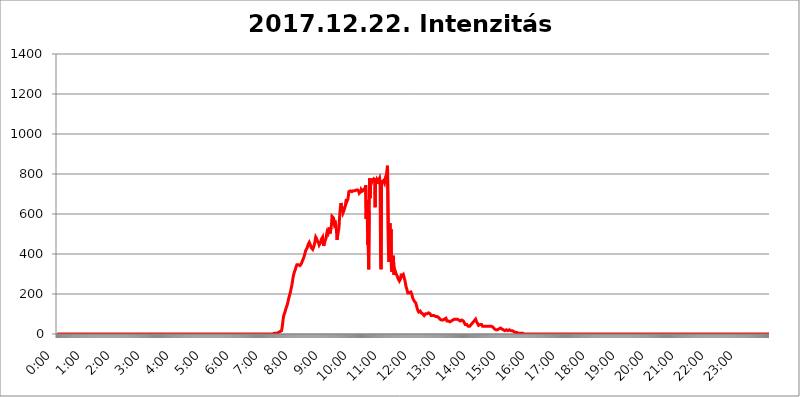
| Category | 2017.12.22. Intenzitás [W/m^2] |
|---|---|
| 0.0 | 0 |
| 0.0006944444444444445 | 0 |
| 0.001388888888888889 | 0 |
| 0.0020833333333333333 | 0 |
| 0.002777777777777778 | 0 |
| 0.003472222222222222 | 0 |
| 0.004166666666666667 | 0 |
| 0.004861111111111111 | 0 |
| 0.005555555555555556 | 0 |
| 0.0062499999999999995 | 0 |
| 0.006944444444444444 | 0 |
| 0.007638888888888889 | 0 |
| 0.008333333333333333 | 0 |
| 0.009027777777777779 | 0 |
| 0.009722222222222222 | 0 |
| 0.010416666666666666 | 0 |
| 0.011111111111111112 | 0 |
| 0.011805555555555555 | 0 |
| 0.012499999999999999 | 0 |
| 0.013194444444444444 | 0 |
| 0.013888888888888888 | 0 |
| 0.014583333333333332 | 0 |
| 0.015277777777777777 | 0 |
| 0.015972222222222224 | 0 |
| 0.016666666666666666 | 0 |
| 0.017361111111111112 | 0 |
| 0.018055555555555557 | 0 |
| 0.01875 | 0 |
| 0.019444444444444445 | 0 |
| 0.02013888888888889 | 0 |
| 0.020833333333333332 | 0 |
| 0.02152777777777778 | 0 |
| 0.022222222222222223 | 0 |
| 0.02291666666666667 | 0 |
| 0.02361111111111111 | 0 |
| 0.024305555555555556 | 0 |
| 0.024999999999999998 | 0 |
| 0.025694444444444447 | 0 |
| 0.02638888888888889 | 0 |
| 0.027083333333333334 | 0 |
| 0.027777777777777776 | 0 |
| 0.02847222222222222 | 0 |
| 0.029166666666666664 | 0 |
| 0.029861111111111113 | 0 |
| 0.030555555555555555 | 0 |
| 0.03125 | 0 |
| 0.03194444444444445 | 0 |
| 0.03263888888888889 | 0 |
| 0.03333333333333333 | 0 |
| 0.034027777777777775 | 0 |
| 0.034722222222222224 | 0 |
| 0.035416666666666666 | 0 |
| 0.036111111111111115 | 0 |
| 0.03680555555555556 | 0 |
| 0.0375 | 0 |
| 0.03819444444444444 | 0 |
| 0.03888888888888889 | 0 |
| 0.03958333333333333 | 0 |
| 0.04027777777777778 | 0 |
| 0.04097222222222222 | 0 |
| 0.041666666666666664 | 0 |
| 0.042361111111111106 | 0 |
| 0.04305555555555556 | 0 |
| 0.043750000000000004 | 0 |
| 0.044444444444444446 | 0 |
| 0.04513888888888889 | 0 |
| 0.04583333333333334 | 0 |
| 0.04652777777777778 | 0 |
| 0.04722222222222222 | 0 |
| 0.04791666666666666 | 0 |
| 0.04861111111111111 | 0 |
| 0.049305555555555554 | 0 |
| 0.049999999999999996 | 0 |
| 0.05069444444444445 | 0 |
| 0.051388888888888894 | 0 |
| 0.052083333333333336 | 0 |
| 0.05277777777777778 | 0 |
| 0.05347222222222222 | 0 |
| 0.05416666666666667 | 0 |
| 0.05486111111111111 | 0 |
| 0.05555555555555555 | 0 |
| 0.05625 | 0 |
| 0.05694444444444444 | 0 |
| 0.057638888888888885 | 0 |
| 0.05833333333333333 | 0 |
| 0.05902777777777778 | 0 |
| 0.059722222222222225 | 0 |
| 0.06041666666666667 | 0 |
| 0.061111111111111116 | 0 |
| 0.06180555555555556 | 0 |
| 0.0625 | 0 |
| 0.06319444444444444 | 0 |
| 0.06388888888888888 | 0 |
| 0.06458333333333334 | 0 |
| 0.06527777777777778 | 0 |
| 0.06597222222222222 | 0 |
| 0.06666666666666667 | 0 |
| 0.06736111111111111 | 0 |
| 0.06805555555555555 | 0 |
| 0.06874999999999999 | 0 |
| 0.06944444444444443 | 0 |
| 0.07013888888888889 | 0 |
| 0.07083333333333333 | 0 |
| 0.07152777777777779 | 0 |
| 0.07222222222222223 | 0 |
| 0.07291666666666667 | 0 |
| 0.07361111111111111 | 0 |
| 0.07430555555555556 | 0 |
| 0.075 | 0 |
| 0.07569444444444444 | 0 |
| 0.0763888888888889 | 0 |
| 0.07708333333333334 | 0 |
| 0.07777777777777778 | 0 |
| 0.07847222222222222 | 0 |
| 0.07916666666666666 | 0 |
| 0.0798611111111111 | 0 |
| 0.08055555555555556 | 0 |
| 0.08125 | 0 |
| 0.08194444444444444 | 0 |
| 0.08263888888888889 | 0 |
| 0.08333333333333333 | 0 |
| 0.08402777777777777 | 0 |
| 0.08472222222222221 | 0 |
| 0.08541666666666665 | 0 |
| 0.08611111111111112 | 0 |
| 0.08680555555555557 | 0 |
| 0.08750000000000001 | 0 |
| 0.08819444444444445 | 0 |
| 0.08888888888888889 | 0 |
| 0.08958333333333333 | 0 |
| 0.09027777777777778 | 0 |
| 0.09097222222222222 | 0 |
| 0.09166666666666667 | 0 |
| 0.09236111111111112 | 0 |
| 0.09305555555555556 | 0 |
| 0.09375 | 0 |
| 0.09444444444444444 | 0 |
| 0.09513888888888888 | 0 |
| 0.09583333333333333 | 0 |
| 0.09652777777777777 | 0 |
| 0.09722222222222222 | 0 |
| 0.09791666666666667 | 0 |
| 0.09861111111111111 | 0 |
| 0.09930555555555555 | 0 |
| 0.09999999999999999 | 0 |
| 0.10069444444444443 | 0 |
| 0.1013888888888889 | 0 |
| 0.10208333333333335 | 0 |
| 0.10277777777777779 | 0 |
| 0.10347222222222223 | 0 |
| 0.10416666666666667 | 0 |
| 0.10486111111111111 | 0 |
| 0.10555555555555556 | 0 |
| 0.10625 | 0 |
| 0.10694444444444444 | 0 |
| 0.1076388888888889 | 0 |
| 0.10833333333333334 | 0 |
| 0.10902777777777778 | 0 |
| 0.10972222222222222 | 0 |
| 0.1111111111111111 | 0 |
| 0.11180555555555556 | 0 |
| 0.11180555555555556 | 0 |
| 0.1125 | 0 |
| 0.11319444444444444 | 0 |
| 0.11388888888888889 | 0 |
| 0.11458333333333333 | 0 |
| 0.11527777777777777 | 0 |
| 0.11597222222222221 | 0 |
| 0.11666666666666665 | 0 |
| 0.1173611111111111 | 0 |
| 0.11805555555555557 | 0 |
| 0.11944444444444445 | 0 |
| 0.12013888888888889 | 0 |
| 0.12083333333333333 | 0 |
| 0.12152777777777778 | 0 |
| 0.12222222222222223 | 0 |
| 0.12291666666666667 | 0 |
| 0.12291666666666667 | 0 |
| 0.12361111111111112 | 0 |
| 0.12430555555555556 | 0 |
| 0.125 | 0 |
| 0.12569444444444444 | 0 |
| 0.12638888888888888 | 0 |
| 0.12708333333333333 | 0 |
| 0.16875 | 0 |
| 0.12847222222222224 | 0 |
| 0.12916666666666668 | 0 |
| 0.12986111111111112 | 0 |
| 0.13055555555555556 | 0 |
| 0.13125 | 0 |
| 0.13194444444444445 | 0 |
| 0.1326388888888889 | 0 |
| 0.13333333333333333 | 0 |
| 0.13402777777777777 | 0 |
| 0.13402777777777777 | 0 |
| 0.13472222222222222 | 0 |
| 0.13541666666666666 | 0 |
| 0.1361111111111111 | 0 |
| 0.13749999999999998 | 0 |
| 0.13819444444444443 | 0 |
| 0.1388888888888889 | 0 |
| 0.13958333333333334 | 0 |
| 0.14027777777777778 | 0 |
| 0.14097222222222222 | 0 |
| 0.14166666666666666 | 0 |
| 0.1423611111111111 | 0 |
| 0.14305555555555557 | 0 |
| 0.14375000000000002 | 0 |
| 0.14444444444444446 | 0 |
| 0.1451388888888889 | 0 |
| 0.1451388888888889 | 0 |
| 0.14652777777777778 | 0 |
| 0.14722222222222223 | 0 |
| 0.14791666666666667 | 0 |
| 0.1486111111111111 | 0 |
| 0.14930555555555555 | 0 |
| 0.15 | 0 |
| 0.15069444444444444 | 0 |
| 0.15138888888888888 | 0 |
| 0.15208333333333332 | 0 |
| 0.15277777777777776 | 0 |
| 0.15347222222222223 | 0 |
| 0.15416666666666667 | 0 |
| 0.15486111111111112 | 0 |
| 0.15555555555555556 | 0 |
| 0.15625 | 0 |
| 0.15694444444444444 | 0 |
| 0.15763888888888888 | 0 |
| 0.15833333333333333 | 0 |
| 0.15902777777777777 | 0 |
| 0.15972222222222224 | 0 |
| 0.16041666666666668 | 0 |
| 0.16111111111111112 | 0 |
| 0.16180555555555556 | 0 |
| 0.1625 | 0 |
| 0.16319444444444445 | 0 |
| 0.1638888888888889 | 0 |
| 0.16458333333333333 | 0 |
| 0.16527777777777777 | 0 |
| 0.16597222222222222 | 0 |
| 0.16666666666666666 | 0 |
| 0.1673611111111111 | 0 |
| 0.16805555555555554 | 0 |
| 0.16874999999999998 | 0 |
| 0.16944444444444443 | 0 |
| 0.17013888888888887 | 0 |
| 0.1708333333333333 | 0 |
| 0.17152777777777775 | 0 |
| 0.17222222222222225 | 0 |
| 0.1729166666666667 | 0 |
| 0.17361111111111113 | 0 |
| 0.17430555555555557 | 0 |
| 0.17500000000000002 | 0 |
| 0.17569444444444446 | 0 |
| 0.1763888888888889 | 0 |
| 0.17708333333333334 | 0 |
| 0.17777777777777778 | 0 |
| 0.17847222222222223 | 0 |
| 0.17916666666666667 | 0 |
| 0.1798611111111111 | 0 |
| 0.18055555555555555 | 0 |
| 0.18125 | 0 |
| 0.18194444444444444 | 0 |
| 0.1826388888888889 | 0 |
| 0.18333333333333335 | 0 |
| 0.1840277777777778 | 0 |
| 0.18472222222222223 | 0 |
| 0.18541666666666667 | 0 |
| 0.18611111111111112 | 0 |
| 0.18680555555555556 | 0 |
| 0.1875 | 0 |
| 0.18819444444444444 | 0 |
| 0.18888888888888888 | 0 |
| 0.18958333333333333 | 0 |
| 0.19027777777777777 | 0 |
| 0.1909722222222222 | 0 |
| 0.19166666666666665 | 0 |
| 0.19236111111111112 | 0 |
| 0.19305555555555554 | 0 |
| 0.19375 | 0 |
| 0.19444444444444445 | 0 |
| 0.1951388888888889 | 0 |
| 0.19583333333333333 | 0 |
| 0.19652777777777777 | 0 |
| 0.19722222222222222 | 0 |
| 0.19791666666666666 | 0 |
| 0.1986111111111111 | 0 |
| 0.19930555555555554 | 0 |
| 0.19999999999999998 | 0 |
| 0.20069444444444443 | 0 |
| 0.20138888888888887 | 0 |
| 0.2020833333333333 | 0 |
| 0.2027777777777778 | 0 |
| 0.2034722222222222 | 0 |
| 0.2041666666666667 | 0 |
| 0.20486111111111113 | 0 |
| 0.20555555555555557 | 0 |
| 0.20625000000000002 | 0 |
| 0.20694444444444446 | 0 |
| 0.2076388888888889 | 0 |
| 0.20833333333333334 | 0 |
| 0.20902777777777778 | 0 |
| 0.20972222222222223 | 0 |
| 0.21041666666666667 | 0 |
| 0.2111111111111111 | 0 |
| 0.21180555555555555 | 0 |
| 0.2125 | 0 |
| 0.21319444444444444 | 0 |
| 0.2138888888888889 | 0 |
| 0.21458333333333335 | 0 |
| 0.2152777777777778 | 0 |
| 0.21597222222222223 | 0 |
| 0.21666666666666667 | 0 |
| 0.21736111111111112 | 0 |
| 0.21805555555555556 | 0 |
| 0.21875 | 0 |
| 0.21944444444444444 | 0 |
| 0.22013888888888888 | 0 |
| 0.22083333333333333 | 0 |
| 0.22152777777777777 | 0 |
| 0.2222222222222222 | 0 |
| 0.22291666666666665 | 0 |
| 0.2236111111111111 | 0 |
| 0.22430555555555556 | 0 |
| 0.225 | 0 |
| 0.22569444444444445 | 0 |
| 0.2263888888888889 | 0 |
| 0.22708333333333333 | 0 |
| 0.22777777777777777 | 0 |
| 0.22847222222222222 | 0 |
| 0.22916666666666666 | 0 |
| 0.2298611111111111 | 0 |
| 0.23055555555555554 | 0 |
| 0.23124999999999998 | 0 |
| 0.23194444444444443 | 0 |
| 0.23263888888888887 | 0 |
| 0.2333333333333333 | 0 |
| 0.2340277777777778 | 0 |
| 0.2347222222222222 | 0 |
| 0.2354166666666667 | 0 |
| 0.23611111111111113 | 0 |
| 0.23680555555555557 | 0 |
| 0.23750000000000002 | 0 |
| 0.23819444444444446 | 0 |
| 0.2388888888888889 | 0 |
| 0.23958333333333334 | 0 |
| 0.24027777777777778 | 0 |
| 0.24097222222222223 | 0 |
| 0.24166666666666667 | 0 |
| 0.2423611111111111 | 0 |
| 0.24305555555555555 | 0 |
| 0.24375 | 0 |
| 0.24444444444444446 | 0 |
| 0.24513888888888888 | 0 |
| 0.24583333333333335 | 0 |
| 0.2465277777777778 | 0 |
| 0.24722222222222223 | 0 |
| 0.24791666666666667 | 0 |
| 0.24861111111111112 | 0 |
| 0.24930555555555556 | 0 |
| 0.25 | 0 |
| 0.25069444444444444 | 0 |
| 0.2513888888888889 | 0 |
| 0.2520833333333333 | 0 |
| 0.25277777777777777 | 0 |
| 0.2534722222222222 | 0 |
| 0.25416666666666665 | 0 |
| 0.2548611111111111 | 0 |
| 0.2555555555555556 | 0 |
| 0.25625000000000003 | 0 |
| 0.2569444444444445 | 0 |
| 0.2576388888888889 | 0 |
| 0.25833333333333336 | 0 |
| 0.2590277777777778 | 0 |
| 0.25972222222222224 | 0 |
| 0.2604166666666667 | 0 |
| 0.2611111111111111 | 0 |
| 0.26180555555555557 | 0 |
| 0.2625 | 0 |
| 0.26319444444444445 | 0 |
| 0.2638888888888889 | 0 |
| 0.26458333333333334 | 0 |
| 0.2652777777777778 | 0 |
| 0.2659722222222222 | 0 |
| 0.26666666666666666 | 0 |
| 0.2673611111111111 | 0 |
| 0.26805555555555555 | 0 |
| 0.26875 | 0 |
| 0.26944444444444443 | 0 |
| 0.2701388888888889 | 0 |
| 0.2708333333333333 | 0 |
| 0.27152777777777776 | 0 |
| 0.2722222222222222 | 0 |
| 0.27291666666666664 | 0 |
| 0.2736111111111111 | 0 |
| 0.2743055555555555 | 0 |
| 0.27499999999999997 | 0 |
| 0.27569444444444446 | 0 |
| 0.27638888888888885 | 0 |
| 0.27708333333333335 | 0 |
| 0.2777777777777778 | 0 |
| 0.27847222222222223 | 0 |
| 0.2791666666666667 | 0 |
| 0.2798611111111111 | 0 |
| 0.28055555555555556 | 0 |
| 0.28125 | 0 |
| 0.28194444444444444 | 0 |
| 0.2826388888888889 | 0 |
| 0.2833333333333333 | 0 |
| 0.28402777777777777 | 0 |
| 0.2847222222222222 | 0 |
| 0.28541666666666665 | 0 |
| 0.28611111111111115 | 0 |
| 0.28680555555555554 | 0 |
| 0.28750000000000003 | 0 |
| 0.2881944444444445 | 0 |
| 0.2888888888888889 | 0 |
| 0.28958333333333336 | 0 |
| 0.2902777777777778 | 0 |
| 0.29097222222222224 | 0 |
| 0.2916666666666667 | 0 |
| 0.2923611111111111 | 0 |
| 0.29305555555555557 | 0 |
| 0.29375 | 0 |
| 0.29444444444444445 | 0 |
| 0.2951388888888889 | 0 |
| 0.29583333333333334 | 0 |
| 0.2965277777777778 | 0 |
| 0.2972222222222222 | 0 |
| 0.29791666666666666 | 0 |
| 0.2986111111111111 | 0 |
| 0.29930555555555555 | 0 |
| 0.3 | 0 |
| 0.30069444444444443 | 0 |
| 0.3013888888888889 | 0 |
| 0.3020833333333333 | 0 |
| 0.30277777777777776 | 3.525 |
| 0.3034722222222222 | 3.525 |
| 0.30416666666666664 | 3.525 |
| 0.3048611111111111 | 3.525 |
| 0.3055555555555555 | 3.525 |
| 0.30624999999999997 | 3.525 |
| 0.3069444444444444 | 3.525 |
| 0.3076388888888889 | 3.525 |
| 0.30833333333333335 | 3.525 |
| 0.3090277777777778 | 3.525 |
| 0.30972222222222223 | 7.887 |
| 0.3104166666666667 | 7.887 |
| 0.3111111111111111 | 7.887 |
| 0.31180555555555556 | 7.887 |
| 0.3125 | 12.257 |
| 0.31319444444444444 | 12.257 |
| 0.3138888888888889 | 12.257 |
| 0.3145833333333333 | 16.636 |
| 0.31527777777777777 | 29.823 |
| 0.3159722222222222 | 47.511 |
| 0.31666666666666665 | 69.775 |
| 0.31736111111111115 | 87.692 |
| 0.31805555555555554 | 96.682 |
| 0.31875000000000003 | 101.184 |
| 0.3194444444444445 | 110.201 |
| 0.3201388888888889 | 119.235 |
| 0.32083333333333336 | 128.284 |
| 0.3215277777777778 | 132.814 |
| 0.32222222222222224 | 141.884 |
| 0.3229166666666667 | 150.964 |
| 0.3236111111111111 | 160.056 |
| 0.32430555555555557 | 173.709 |
| 0.325 | 182.82 |
| 0.32569444444444445 | 191.937 |
| 0.3263888888888889 | 201.058 |
| 0.32708333333333334 | 210.182 |
| 0.3277777777777778 | 223.873 |
| 0.3284722222222222 | 233 |
| 0.32916666666666666 | 246.689 |
| 0.3298611111111111 | 260.373 |
| 0.33055555555555555 | 278.603 |
| 0.33125 | 292.259 |
| 0.33194444444444443 | 301.354 |
| 0.3326388888888889 | 310.44 |
| 0.3333333333333333 | 314.98 |
| 0.3340277777777778 | 324.052 |
| 0.3347222222222222 | 333.113 |
| 0.3354166666666667 | 337.639 |
| 0.3361111111111111 | 346.682 |
| 0.3368055555555556 | 346.682 |
| 0.33749999999999997 | 346.682 |
| 0.33819444444444446 | 346.682 |
| 0.33888888888888885 | 346.682 |
| 0.33958333333333335 | 342.162 |
| 0.34027777777777773 | 342.162 |
| 0.34097222222222223 | 342.162 |
| 0.3416666666666666 | 346.682 |
| 0.3423611111111111 | 351.198 |
| 0.3430555555555555 | 355.712 |
| 0.34375 | 364.728 |
| 0.3444444444444445 | 369.23 |
| 0.3451388888888889 | 369.23 |
| 0.3458333333333334 | 382.715 |
| 0.34652777777777777 | 391.685 |
| 0.34722222222222227 | 400.638 |
| 0.34791666666666665 | 409.574 |
| 0.34861111111111115 | 418.492 |
| 0.34930555555555554 | 418.492 |
| 0.35000000000000003 | 418.492 |
| 0.3506944444444444 | 431.833 |
| 0.3513888888888889 | 440.702 |
| 0.3520833333333333 | 449.551 |
| 0.3527777777777778 | 453.968 |
| 0.3534722222222222 | 458.38 |
| 0.3541666666666667 | 453.968 |
| 0.3548611111111111 | 453.968 |
| 0.35555555555555557 | 440.702 |
| 0.35625 | 431.833 |
| 0.35694444444444445 | 431.833 |
| 0.3576388888888889 | 427.39 |
| 0.35833333333333334 | 422.943 |
| 0.3590277777777778 | 422.943 |
| 0.3597222222222222 | 436.27 |
| 0.36041666666666666 | 445.129 |
| 0.3611111111111111 | 453.968 |
| 0.36180555555555555 | 471.582 |
| 0.3625 | 484.735 |
| 0.36319444444444443 | 484.735 |
| 0.3638888888888889 | 475.972 |
| 0.3645833333333333 | 467.187 |
| 0.3652777777777778 | 462.786 |
| 0.3659722222222222 | 467.187 |
| 0.3666666666666667 | 453.968 |
| 0.3673611111111111 | 445.129 |
| 0.3680555555555556 | 440.702 |
| 0.36874999999999997 | 449.551 |
| 0.36944444444444446 | 458.38 |
| 0.37013888888888885 | 471.582 |
| 0.37083333333333335 | 471.582 |
| 0.37152777777777773 | 471.582 |
| 0.37222222222222223 | 484.735 |
| 0.3729166666666666 | 462.786 |
| 0.3736111111111111 | 440.702 |
| 0.3743055555555555 | 440.702 |
| 0.375 | 458.38 |
| 0.3756944444444445 | 462.786 |
| 0.3763888888888889 | 462.786 |
| 0.3770833333333334 | 480.356 |
| 0.37777777777777777 | 497.836 |
| 0.37847222222222227 | 510.885 |
| 0.37916666666666665 | 510.885 |
| 0.37986111111111115 | 502.192 |
| 0.38055555555555554 | 510.885 |
| 0.38125000000000003 | 532.513 |
| 0.3819444444444444 | 515.223 |
| 0.3826388888888889 | 502.192 |
| 0.3833333333333333 | 506.542 |
| 0.3840277777777778 | 532.513 |
| 0.3847222222222222 | 549.704 |
| 0.3854166666666667 | 588.009 |
| 0.3861111111111111 | 592.233 |
| 0.38680555555555557 | 588.009 |
| 0.3875 | 579.542 |
| 0.38819444444444445 | 558.261 |
| 0.3888888888888889 | 545.416 |
| 0.38958333333333334 | 545.416 |
| 0.3902777777777778 | 553.986 |
| 0.3909722222222222 | 541.121 |
| 0.39166666666666666 | 515.223 |
| 0.3923611111111111 | 471.582 |
| 0.39305555555555555 | 484.735 |
| 0.39375 | 502.192 |
| 0.39444444444444443 | 506.542 |
| 0.3951388888888889 | 532.513 |
| 0.3958333333333333 | 575.299 |
| 0.3965277777777778 | 613.252 |
| 0.3972222222222222 | 634.105 |
| 0.3979166666666667 | 654.791 |
| 0.3986111111111111 | 658.909 |
| 0.3993055555555556 | 650.667 |
| 0.39999999999999997 | 617.436 |
| 0.40069444444444446 | 604.864 |
| 0.40138888888888885 | 609.062 |
| 0.40208333333333335 | 617.436 |
| 0.40277777777777773 | 617.436 |
| 0.40347222222222223 | 621.613 |
| 0.4041666666666666 | 642.4 |
| 0.4048611111111111 | 663.019 |
| 0.4055555555555555 | 675.311 |
| 0.40625 | 663.019 |
| 0.4069444444444445 | 667.123 |
| 0.4076388888888889 | 675.311 |
| 0.4083333333333334 | 691.608 |
| 0.40902777777777777 | 711.832 |
| 0.40972222222222227 | 707.8 |
| 0.41041666666666665 | 715.858 |
| 0.41111111111111115 | 715.858 |
| 0.41180555555555554 | 711.832 |
| 0.41250000000000003 | 711.832 |
| 0.4131944444444444 | 711.832 |
| 0.4138888888888889 | 715.858 |
| 0.4145833333333333 | 707.8 |
| 0.4152777777777778 | 715.858 |
| 0.4159722222222222 | 719.877 |
| 0.4166666666666667 | 711.832 |
| 0.4173611111111111 | 715.858 |
| 0.41805555555555557 | 719.877 |
| 0.41875 | 719.877 |
| 0.41944444444444445 | 719.877 |
| 0.4201388888888889 | 719.877 |
| 0.42083333333333334 | 719.877 |
| 0.4215277777777778 | 719.877 |
| 0.4222222222222222 | 715.858 |
| 0.42291666666666666 | 711.832 |
| 0.4236111111111111 | 703.762 |
| 0.42430555555555555 | 703.762 |
| 0.425 | 703.762 |
| 0.42569444444444443 | 711.832 |
| 0.4263888888888889 | 723.889 |
| 0.4270833333333333 | 727.896 |
| 0.4277777777777778 | 719.877 |
| 0.4284722222222222 | 715.858 |
| 0.4291666666666667 | 715.858 |
| 0.4298611111111111 | 719.877 |
| 0.4305555555555556 | 723.889 |
| 0.43124999999999997 | 727.896 |
| 0.43194444444444446 | 731.896 |
| 0.43263888888888885 | 743.859 |
| 0.43333333333333335 | 575.299 |
| 0.43402777777777773 | 667.123 |
| 0.43472222222222223 | 621.613 |
| 0.4354166666666666 | 445.129 |
| 0.4361111111111111 | 475.972 |
| 0.4368055555555555 | 324.052 |
| 0.4375 | 617.436 |
| 0.4381944444444445 | 779.42 |
| 0.4388888888888889 | 679.395 |
| 0.4395833333333334 | 775.492 |
| 0.44027777777777777 | 767.62 |
| 0.44097222222222227 | 759.723 |
| 0.44166666666666665 | 767.62 |
| 0.44236111111111115 | 763.674 |
| 0.44305555555555554 | 767.62 |
| 0.44375000000000003 | 775.492 |
| 0.4444444444444444 | 775.492 |
| 0.4451388888888889 | 767.62 |
| 0.4458333333333333 | 634.105 |
| 0.4465277777777778 | 779.42 |
| 0.4472222222222222 | 759.723 |
| 0.4479166666666667 | 751.803 |
| 0.4486111111111111 | 771.559 |
| 0.44930555555555557 | 771.559 |
| 0.45 | 763.674 |
| 0.45069444444444445 | 763.674 |
| 0.4513888888888889 | 759.723 |
| 0.45208333333333334 | 779.42 |
| 0.4527777777777778 | 759.723 |
| 0.4534722222222222 | 387.202 |
| 0.45416666666666666 | 324.052 |
| 0.4548611111111111 | 767.62 |
| 0.45555555555555555 | 759.723 |
| 0.45625 | 759.723 |
| 0.45694444444444443 | 755.766 |
| 0.4576388888888889 | 767.62 |
| 0.4583333333333333 | 767.62 |
| 0.4590277777777778 | 755.766 |
| 0.4597222222222222 | 759.723 |
| 0.4604166666666667 | 783.342 |
| 0.4611111111111111 | 783.342 |
| 0.4618055555555556 | 798.974 |
| 0.46249999999999997 | 822.26 |
| 0.46319444444444446 | 841.526 |
| 0.46388888888888885 | 841.526 |
| 0.46458333333333335 | 405.108 |
| 0.46527777777777773 | 360.221 |
| 0.46597222222222223 | 445.129 |
| 0.4666666666666666 | 553.986 |
| 0.4673611111111111 | 360.221 |
| 0.4680555555555555 | 523.88 |
| 0.46875 | 324.052 |
| 0.4694444444444445 | 310.44 |
| 0.4701388888888889 | 305.898 |
| 0.4708333333333334 | 333.113 |
| 0.47152777777777777 | 391.685 |
| 0.47222222222222227 | 296.808 |
| 0.47291666666666665 | 301.354 |
| 0.47361111111111115 | 319.517 |
| 0.47430555555555554 | 324.052 |
| 0.47500000000000003 | 314.98 |
| 0.4756944444444444 | 296.808 |
| 0.4763888888888889 | 292.259 |
| 0.4770833333333333 | 287.709 |
| 0.4777777777777778 | 278.603 |
| 0.4784722222222222 | 278.603 |
| 0.4791666666666667 | 274.047 |
| 0.4798611111111111 | 264.932 |
| 0.48055555555555557 | 269.49 |
| 0.48125 | 274.047 |
| 0.48194444444444445 | 287.709 |
| 0.4826388888888889 | 301.354 |
| 0.48333333333333334 | 287.709 |
| 0.4840277777777778 | 287.709 |
| 0.4847222222222222 | 292.259 |
| 0.48541666666666666 | 296.808 |
| 0.4861111111111111 | 292.259 |
| 0.48680555555555555 | 278.603 |
| 0.4875 | 269.49 |
| 0.48819444444444443 | 255.813 |
| 0.4888888888888889 | 242.127 |
| 0.4895833333333333 | 233 |
| 0.4902777777777778 | 223.873 |
| 0.4909722222222222 | 214.746 |
| 0.4916666666666667 | 205.62 |
| 0.4923611111111111 | 201.058 |
| 0.4930555555555556 | 201.058 |
| 0.49374999999999997 | 205.62 |
| 0.49444444444444446 | 205.62 |
| 0.49513888888888885 | 205.62 |
| 0.49583333333333335 | 210.182 |
| 0.49652777777777773 | 205.62 |
| 0.49722222222222223 | 201.058 |
| 0.4979166666666666 | 187.378 |
| 0.4986111111111111 | 182.82 |
| 0.4993055555555555 | 173.709 |
| 0.5 | 169.156 |
| 0.5006944444444444 | 164.605 |
| 0.5013888888888889 | 164.605 |
| 0.5020833333333333 | 160.056 |
| 0.5027777777777778 | 155.509 |
| 0.5034722222222222 | 146.423 |
| 0.5041666666666667 | 137.347 |
| 0.5048611111111111 | 128.284 |
| 0.5055555555555555 | 119.235 |
| 0.50625 | 114.716 |
| 0.5069444444444444 | 110.201 |
| 0.5076388888888889 | 114.716 |
| 0.5083333333333333 | 114.716 |
| 0.5090277777777777 | 114.716 |
| 0.5097222222222222 | 110.201 |
| 0.5104166666666666 | 105.69 |
| 0.5111111111111112 | 105.69 |
| 0.5118055555555555 | 101.184 |
| 0.5125000000000001 | 101.184 |
| 0.5131944444444444 | 101.184 |
| 0.513888888888889 | 96.682 |
| 0.5145833333333333 | 92.184 |
| 0.5152777777777778 | 92.184 |
| 0.5159722222222222 | 96.682 |
| 0.5166666666666667 | 101.184 |
| 0.517361111111111 | 105.69 |
| 0.5180555555555556 | 105.69 |
| 0.5187499999999999 | 101.184 |
| 0.5194444444444445 | 101.184 |
| 0.5201388888888888 | 101.184 |
| 0.5208333333333334 | 105.69 |
| 0.5215277777777778 | 105.69 |
| 0.5222222222222223 | 101.184 |
| 0.5229166666666667 | 101.184 |
| 0.5236111111111111 | 96.682 |
| 0.5243055555555556 | 92.184 |
| 0.525 | 92.184 |
| 0.5256944444444445 | 92.184 |
| 0.5263888888888889 | 92.184 |
| 0.5270833333333333 | 87.692 |
| 0.5277777777777778 | 92.184 |
| 0.5284722222222222 | 92.184 |
| 0.5291666666666667 | 92.184 |
| 0.5298611111111111 | 87.692 |
| 0.5305555555555556 | 87.692 |
| 0.53125 | 83.205 |
| 0.5319444444444444 | 83.205 |
| 0.5326388888888889 | 87.692 |
| 0.5333333333333333 | 87.692 |
| 0.5340277777777778 | 83.205 |
| 0.5347222222222222 | 83.205 |
| 0.5354166666666667 | 78.722 |
| 0.5361111111111111 | 78.722 |
| 0.5368055555555555 | 74.246 |
| 0.5375 | 74.246 |
| 0.5381944444444444 | 69.775 |
| 0.5388888888888889 | 69.775 |
| 0.5395833333333333 | 65.31 |
| 0.5402777777777777 | 69.775 |
| 0.5409722222222222 | 69.775 |
| 0.5416666666666666 | 69.775 |
| 0.5423611111111112 | 74.246 |
| 0.5430555555555555 | 74.246 |
| 0.5437500000000001 | 74.246 |
| 0.5444444444444444 | 74.246 |
| 0.545138888888889 | 78.722 |
| 0.5458333333333333 | 74.246 |
| 0.5465277777777778 | 65.31 |
| 0.5472222222222222 | 65.31 |
| 0.5479166666666667 | 65.31 |
| 0.548611111111111 | 65.31 |
| 0.5493055555555556 | 60.85 |
| 0.5499999999999999 | 60.85 |
| 0.5506944444444445 | 60.85 |
| 0.5513888888888888 | 60.85 |
| 0.5520833333333334 | 60.85 |
| 0.5527777777777778 | 65.31 |
| 0.5534722222222223 | 65.31 |
| 0.5541666666666667 | 69.775 |
| 0.5548611111111111 | 69.775 |
| 0.5555555555555556 | 74.246 |
| 0.55625 | 74.246 |
| 0.5569444444444445 | 74.246 |
| 0.5576388888888889 | 74.246 |
| 0.5583333333333333 | 74.246 |
| 0.5590277777777778 | 74.246 |
| 0.5597222222222222 | 74.246 |
| 0.5604166666666667 | 74.246 |
| 0.5611111111111111 | 74.246 |
| 0.5618055555555556 | 74.246 |
| 0.5625 | 74.246 |
| 0.5631944444444444 | 69.775 |
| 0.5638888888888889 | 65.31 |
| 0.5645833333333333 | 65.31 |
| 0.5652777777777778 | 65.31 |
| 0.5659722222222222 | 65.31 |
| 0.5666666666666667 | 69.775 |
| 0.5673611111111111 | 69.775 |
| 0.5680555555555555 | 69.775 |
| 0.56875 | 65.31 |
| 0.5694444444444444 | 65.31 |
| 0.5701388888888889 | 60.85 |
| 0.5708333333333333 | 56.398 |
| 0.5715277777777777 | 51.951 |
| 0.5722222222222222 | 47.511 |
| 0.5729166666666666 | 43.079 |
| 0.5736111111111112 | 43.079 |
| 0.5743055555555555 | 47.511 |
| 0.5750000000000001 | 43.079 |
| 0.5756944444444444 | 43.079 |
| 0.576388888888889 | 38.653 |
| 0.5770833333333333 | 34.234 |
| 0.5777777777777778 | 34.234 |
| 0.5784722222222222 | 38.653 |
| 0.5791666666666667 | 38.653 |
| 0.579861111111111 | 43.079 |
| 0.5805555555555556 | 47.511 |
| 0.5812499999999999 | 47.511 |
| 0.5819444444444445 | 51.951 |
| 0.5826388888888888 | 56.398 |
| 0.5833333333333334 | 60.85 |
| 0.5840277777777778 | 60.85 |
| 0.5847222222222223 | 65.31 |
| 0.5854166666666667 | 65.31 |
| 0.5861111111111111 | 69.775 |
| 0.5868055555555556 | 74.246 |
| 0.5875 | 69.775 |
| 0.5881944444444445 | 60.85 |
| 0.5888888888888889 | 56.398 |
| 0.5895833333333333 | 51.951 |
| 0.5902777777777778 | 47.511 |
| 0.5909722222222222 | 43.079 |
| 0.5916666666666667 | 43.079 |
| 0.5923611111111111 | 43.079 |
| 0.5930555555555556 | 47.511 |
| 0.59375 | 47.511 |
| 0.5944444444444444 | 47.511 |
| 0.5951388888888889 | 47.511 |
| 0.5958333333333333 | 43.079 |
| 0.5965277777777778 | 38.653 |
| 0.5972222222222222 | 38.653 |
| 0.5979166666666667 | 38.653 |
| 0.5986111111111111 | 38.653 |
| 0.5993055555555555 | 38.653 |
| 0.6 | 38.653 |
| 0.6006944444444444 | 38.653 |
| 0.6013888888888889 | 38.653 |
| 0.6020833333333333 | 38.653 |
| 0.6027777777777777 | 38.653 |
| 0.6034722222222222 | 38.653 |
| 0.6041666666666666 | 38.653 |
| 0.6048611111111112 | 38.653 |
| 0.6055555555555555 | 38.653 |
| 0.6062500000000001 | 38.653 |
| 0.6069444444444444 | 38.653 |
| 0.607638888888889 | 38.653 |
| 0.6083333333333333 | 38.653 |
| 0.6090277777777778 | 38.653 |
| 0.6097222222222222 | 38.653 |
| 0.6104166666666667 | 38.653 |
| 0.611111111111111 | 34.234 |
| 0.6118055555555556 | 29.823 |
| 0.6124999999999999 | 29.823 |
| 0.6131944444444445 | 25.419 |
| 0.6138888888888888 | 21.024 |
| 0.6145833333333334 | 21.024 |
| 0.6152777777777778 | 21.024 |
| 0.6159722222222223 | 21.024 |
| 0.6166666666666667 | 25.419 |
| 0.6173611111111111 | 21.024 |
| 0.6180555555555556 | 25.419 |
| 0.61875 | 21.024 |
| 0.6194444444444445 | 25.419 |
| 0.6201388888888889 | 25.419 |
| 0.6208333333333333 | 25.419 |
| 0.6215277777777778 | 29.823 |
| 0.6222222222222222 | 25.419 |
| 0.6229166666666667 | 29.823 |
| 0.6236111111111111 | 25.419 |
| 0.6243055555555556 | 25.419 |
| 0.625 | 25.419 |
| 0.6256944444444444 | 21.024 |
| 0.6263888888888889 | 21.024 |
| 0.6270833333333333 | 21.024 |
| 0.6277777777777778 | 16.636 |
| 0.6284722222222222 | 16.636 |
| 0.6291666666666667 | 21.024 |
| 0.6298611111111111 | 21.024 |
| 0.6305555555555555 | 16.636 |
| 0.63125 | 21.024 |
| 0.6319444444444444 | 16.636 |
| 0.6326388888888889 | 16.636 |
| 0.6333333333333333 | 16.636 |
| 0.6340277777777777 | 21.024 |
| 0.6347222222222222 | 16.636 |
| 0.6354166666666666 | 16.636 |
| 0.6361111111111112 | 16.636 |
| 0.6368055555555555 | 16.636 |
| 0.6375000000000001 | 16.636 |
| 0.6381944444444444 | 16.636 |
| 0.638888888888889 | 12.257 |
| 0.6395833333333333 | 12.257 |
| 0.6402777777777778 | 12.257 |
| 0.6409722222222222 | 12.257 |
| 0.6416666666666667 | 7.887 |
| 0.642361111111111 | 7.887 |
| 0.6430555555555556 | 7.887 |
| 0.6437499999999999 | 7.887 |
| 0.6444444444444445 | 7.887 |
| 0.6451388888888888 | 7.887 |
| 0.6458333333333334 | 7.887 |
| 0.6465277777777778 | 3.525 |
| 0.6472222222222223 | 3.525 |
| 0.6479166666666667 | 3.525 |
| 0.6486111111111111 | 3.525 |
| 0.6493055555555556 | 3.525 |
| 0.65 | 3.525 |
| 0.6506944444444445 | 3.525 |
| 0.6513888888888889 | 3.525 |
| 0.6520833333333333 | 3.525 |
| 0.6527777777777778 | 3.525 |
| 0.6534722222222222 | 3.525 |
| 0.6541666666666667 | 0 |
| 0.6548611111111111 | 0 |
| 0.6555555555555556 | 3.525 |
| 0.65625 | 0 |
| 0.6569444444444444 | 0 |
| 0.6576388888888889 | 0 |
| 0.6583333333333333 | 0 |
| 0.6590277777777778 | 0 |
| 0.6597222222222222 | 0 |
| 0.6604166666666667 | 0 |
| 0.6611111111111111 | 0 |
| 0.6618055555555555 | 0 |
| 0.6625 | 0 |
| 0.6631944444444444 | 0 |
| 0.6638888888888889 | 0 |
| 0.6645833333333333 | 0 |
| 0.6652777777777777 | 0 |
| 0.6659722222222222 | 0 |
| 0.6666666666666666 | 0 |
| 0.6673611111111111 | 0 |
| 0.6680555555555556 | 0 |
| 0.6687500000000001 | 0 |
| 0.6694444444444444 | 0 |
| 0.6701388888888888 | 0 |
| 0.6708333333333334 | 0 |
| 0.6715277777777778 | 0 |
| 0.6722222222222222 | 0 |
| 0.6729166666666666 | 0 |
| 0.6736111111111112 | 0 |
| 0.6743055555555556 | 0 |
| 0.6749999999999999 | 0 |
| 0.6756944444444444 | 0 |
| 0.6763888888888889 | 0 |
| 0.6770833333333334 | 0 |
| 0.6777777777777777 | 0 |
| 0.6784722222222223 | 0 |
| 0.6791666666666667 | 0 |
| 0.6798611111111111 | 0 |
| 0.6805555555555555 | 0 |
| 0.68125 | 0 |
| 0.6819444444444445 | 0 |
| 0.6826388888888889 | 0 |
| 0.6833333333333332 | 0 |
| 0.6840277777777778 | 0 |
| 0.6847222222222222 | 0 |
| 0.6854166666666667 | 0 |
| 0.686111111111111 | 0 |
| 0.6868055555555556 | 0 |
| 0.6875 | 0 |
| 0.6881944444444444 | 0 |
| 0.688888888888889 | 0 |
| 0.6895833333333333 | 0 |
| 0.6902777777777778 | 0 |
| 0.6909722222222222 | 0 |
| 0.6916666666666668 | 0 |
| 0.6923611111111111 | 0 |
| 0.6930555555555555 | 0 |
| 0.69375 | 0 |
| 0.6944444444444445 | 0 |
| 0.6951388888888889 | 0 |
| 0.6958333333333333 | 0 |
| 0.6965277777777777 | 0 |
| 0.6972222222222223 | 0 |
| 0.6979166666666666 | 0 |
| 0.6986111111111111 | 0 |
| 0.6993055555555556 | 0 |
| 0.7000000000000001 | 0 |
| 0.7006944444444444 | 0 |
| 0.7013888888888888 | 0 |
| 0.7020833333333334 | 0 |
| 0.7027777777777778 | 0 |
| 0.7034722222222222 | 0 |
| 0.7041666666666666 | 0 |
| 0.7048611111111112 | 0 |
| 0.7055555555555556 | 0 |
| 0.7062499999999999 | 0 |
| 0.7069444444444444 | 0 |
| 0.7076388888888889 | 0 |
| 0.7083333333333334 | 0 |
| 0.7090277777777777 | 0 |
| 0.7097222222222223 | 0 |
| 0.7104166666666667 | 0 |
| 0.7111111111111111 | 0 |
| 0.7118055555555555 | 0 |
| 0.7125 | 0 |
| 0.7131944444444445 | 0 |
| 0.7138888888888889 | 0 |
| 0.7145833333333332 | 0 |
| 0.7152777777777778 | 0 |
| 0.7159722222222222 | 0 |
| 0.7166666666666667 | 0 |
| 0.717361111111111 | 0 |
| 0.7180555555555556 | 0 |
| 0.71875 | 0 |
| 0.7194444444444444 | 0 |
| 0.720138888888889 | 0 |
| 0.7208333333333333 | 0 |
| 0.7215277777777778 | 0 |
| 0.7222222222222222 | 0 |
| 0.7229166666666668 | 0 |
| 0.7236111111111111 | 0 |
| 0.7243055555555555 | 0 |
| 0.725 | 0 |
| 0.7256944444444445 | 0 |
| 0.7263888888888889 | 0 |
| 0.7270833333333333 | 0 |
| 0.7277777777777777 | 0 |
| 0.7284722222222223 | 0 |
| 0.7291666666666666 | 0 |
| 0.7298611111111111 | 0 |
| 0.7305555555555556 | 0 |
| 0.7312500000000001 | 0 |
| 0.7319444444444444 | 0 |
| 0.7326388888888888 | 0 |
| 0.7333333333333334 | 0 |
| 0.7340277777777778 | 0 |
| 0.7347222222222222 | 0 |
| 0.7354166666666666 | 0 |
| 0.7361111111111112 | 0 |
| 0.7368055555555556 | 0 |
| 0.7374999999999999 | 0 |
| 0.7381944444444444 | 0 |
| 0.7388888888888889 | 0 |
| 0.7395833333333334 | 0 |
| 0.7402777777777777 | 0 |
| 0.7409722222222223 | 0 |
| 0.7416666666666667 | 0 |
| 0.7423611111111111 | 0 |
| 0.7430555555555555 | 0 |
| 0.74375 | 0 |
| 0.7444444444444445 | 0 |
| 0.7451388888888889 | 0 |
| 0.7458333333333332 | 0 |
| 0.7465277777777778 | 0 |
| 0.7472222222222222 | 0 |
| 0.7479166666666667 | 0 |
| 0.748611111111111 | 0 |
| 0.7493055555555556 | 0 |
| 0.75 | 0 |
| 0.7506944444444444 | 0 |
| 0.751388888888889 | 0 |
| 0.7520833333333333 | 0 |
| 0.7527777777777778 | 0 |
| 0.7534722222222222 | 0 |
| 0.7541666666666668 | 0 |
| 0.7548611111111111 | 0 |
| 0.7555555555555555 | 0 |
| 0.75625 | 0 |
| 0.7569444444444445 | 0 |
| 0.7576388888888889 | 0 |
| 0.7583333333333333 | 0 |
| 0.7590277777777777 | 0 |
| 0.7597222222222223 | 0 |
| 0.7604166666666666 | 0 |
| 0.7611111111111111 | 0 |
| 0.7618055555555556 | 0 |
| 0.7625000000000001 | 0 |
| 0.7631944444444444 | 0 |
| 0.7638888888888888 | 0 |
| 0.7645833333333334 | 0 |
| 0.7652777777777778 | 0 |
| 0.7659722222222222 | 0 |
| 0.7666666666666666 | 0 |
| 0.7673611111111112 | 0 |
| 0.7680555555555556 | 0 |
| 0.7687499999999999 | 0 |
| 0.7694444444444444 | 0 |
| 0.7701388888888889 | 0 |
| 0.7708333333333334 | 0 |
| 0.7715277777777777 | 0 |
| 0.7722222222222223 | 0 |
| 0.7729166666666667 | 0 |
| 0.7736111111111111 | 0 |
| 0.7743055555555555 | 0 |
| 0.775 | 0 |
| 0.7756944444444445 | 0 |
| 0.7763888888888889 | 0 |
| 0.7770833333333332 | 0 |
| 0.7777777777777778 | 0 |
| 0.7784722222222222 | 0 |
| 0.7791666666666667 | 0 |
| 0.779861111111111 | 0 |
| 0.7805555555555556 | 0 |
| 0.78125 | 0 |
| 0.7819444444444444 | 0 |
| 0.782638888888889 | 0 |
| 0.7833333333333333 | 0 |
| 0.7840277777777778 | 0 |
| 0.7847222222222222 | 0 |
| 0.7854166666666668 | 0 |
| 0.7861111111111111 | 0 |
| 0.7868055555555555 | 0 |
| 0.7875 | 0 |
| 0.7881944444444445 | 0 |
| 0.7888888888888889 | 0 |
| 0.7895833333333333 | 0 |
| 0.7902777777777777 | 0 |
| 0.7909722222222223 | 0 |
| 0.7916666666666666 | 0 |
| 0.7923611111111111 | 0 |
| 0.7930555555555556 | 0 |
| 0.7937500000000001 | 0 |
| 0.7944444444444444 | 0 |
| 0.7951388888888888 | 0 |
| 0.7958333333333334 | 0 |
| 0.7965277777777778 | 0 |
| 0.7972222222222222 | 0 |
| 0.7979166666666666 | 0 |
| 0.7986111111111112 | 0 |
| 0.7993055555555556 | 0 |
| 0.7999999999999999 | 0 |
| 0.8006944444444444 | 0 |
| 0.8013888888888889 | 0 |
| 0.8020833333333334 | 0 |
| 0.8027777777777777 | 0 |
| 0.8034722222222223 | 0 |
| 0.8041666666666667 | 0 |
| 0.8048611111111111 | 0 |
| 0.8055555555555555 | 0 |
| 0.80625 | 0 |
| 0.8069444444444445 | 0 |
| 0.8076388888888889 | 0 |
| 0.8083333333333332 | 0 |
| 0.8090277777777778 | 0 |
| 0.8097222222222222 | 0 |
| 0.8104166666666667 | 0 |
| 0.811111111111111 | 0 |
| 0.8118055555555556 | 0 |
| 0.8125 | 0 |
| 0.8131944444444444 | 0 |
| 0.813888888888889 | 0 |
| 0.8145833333333333 | 0 |
| 0.8152777777777778 | 0 |
| 0.8159722222222222 | 0 |
| 0.8166666666666668 | 0 |
| 0.8173611111111111 | 0 |
| 0.8180555555555555 | 0 |
| 0.81875 | 0 |
| 0.8194444444444445 | 0 |
| 0.8201388888888889 | 0 |
| 0.8208333333333333 | 0 |
| 0.8215277777777777 | 0 |
| 0.8222222222222223 | 0 |
| 0.8229166666666666 | 0 |
| 0.8236111111111111 | 0 |
| 0.8243055555555556 | 0 |
| 0.8250000000000001 | 0 |
| 0.8256944444444444 | 0 |
| 0.8263888888888888 | 0 |
| 0.8270833333333334 | 0 |
| 0.8277777777777778 | 0 |
| 0.8284722222222222 | 0 |
| 0.8291666666666666 | 0 |
| 0.8298611111111112 | 0 |
| 0.8305555555555556 | 0 |
| 0.8312499999999999 | 0 |
| 0.8319444444444444 | 0 |
| 0.8326388888888889 | 0 |
| 0.8333333333333334 | 0 |
| 0.8340277777777777 | 0 |
| 0.8347222222222223 | 0 |
| 0.8354166666666667 | 0 |
| 0.8361111111111111 | 0 |
| 0.8368055555555555 | 0 |
| 0.8375 | 0 |
| 0.8381944444444445 | 0 |
| 0.8388888888888889 | 0 |
| 0.8395833333333332 | 0 |
| 0.8402777777777778 | 0 |
| 0.8409722222222222 | 0 |
| 0.8416666666666667 | 0 |
| 0.842361111111111 | 0 |
| 0.8430555555555556 | 0 |
| 0.84375 | 0 |
| 0.8444444444444444 | 0 |
| 0.845138888888889 | 0 |
| 0.8458333333333333 | 0 |
| 0.8465277777777778 | 0 |
| 0.8472222222222222 | 0 |
| 0.8479166666666668 | 0 |
| 0.8486111111111111 | 0 |
| 0.8493055555555555 | 0 |
| 0.85 | 0 |
| 0.8506944444444445 | 0 |
| 0.8513888888888889 | 0 |
| 0.8520833333333333 | 0 |
| 0.8527777777777777 | 0 |
| 0.8534722222222223 | 0 |
| 0.8541666666666666 | 0 |
| 0.8548611111111111 | 0 |
| 0.8555555555555556 | 0 |
| 0.8562500000000001 | 0 |
| 0.8569444444444444 | 0 |
| 0.8576388888888888 | 0 |
| 0.8583333333333334 | 0 |
| 0.8590277777777778 | 0 |
| 0.8597222222222222 | 0 |
| 0.8604166666666666 | 0 |
| 0.8611111111111112 | 0 |
| 0.8618055555555556 | 0 |
| 0.8624999999999999 | 0 |
| 0.8631944444444444 | 0 |
| 0.8638888888888889 | 0 |
| 0.8645833333333334 | 0 |
| 0.8652777777777777 | 0 |
| 0.8659722222222223 | 0 |
| 0.8666666666666667 | 0 |
| 0.8673611111111111 | 0 |
| 0.8680555555555555 | 0 |
| 0.86875 | 0 |
| 0.8694444444444445 | 0 |
| 0.8701388888888889 | 0 |
| 0.8708333333333332 | 0 |
| 0.8715277777777778 | 0 |
| 0.8722222222222222 | 0 |
| 0.8729166666666667 | 0 |
| 0.873611111111111 | 0 |
| 0.8743055555555556 | 0 |
| 0.875 | 0 |
| 0.8756944444444444 | 0 |
| 0.876388888888889 | 0 |
| 0.8770833333333333 | 0 |
| 0.8777777777777778 | 0 |
| 0.8784722222222222 | 0 |
| 0.8791666666666668 | 0 |
| 0.8798611111111111 | 0 |
| 0.8805555555555555 | 0 |
| 0.88125 | 0 |
| 0.8819444444444445 | 0 |
| 0.8826388888888889 | 0 |
| 0.8833333333333333 | 0 |
| 0.8840277777777777 | 0 |
| 0.8847222222222223 | 0 |
| 0.8854166666666666 | 0 |
| 0.8861111111111111 | 0 |
| 0.8868055555555556 | 0 |
| 0.8875000000000001 | 0 |
| 0.8881944444444444 | 0 |
| 0.8888888888888888 | 0 |
| 0.8895833333333334 | 0 |
| 0.8902777777777778 | 0 |
| 0.8909722222222222 | 0 |
| 0.8916666666666666 | 0 |
| 0.8923611111111112 | 0 |
| 0.8930555555555556 | 0 |
| 0.8937499999999999 | 0 |
| 0.8944444444444444 | 0 |
| 0.8951388888888889 | 0 |
| 0.8958333333333334 | 0 |
| 0.8965277777777777 | 0 |
| 0.8972222222222223 | 0 |
| 0.8979166666666667 | 0 |
| 0.8986111111111111 | 0 |
| 0.8993055555555555 | 0 |
| 0.9 | 0 |
| 0.9006944444444445 | 0 |
| 0.9013888888888889 | 0 |
| 0.9020833333333332 | 0 |
| 0.9027777777777778 | 0 |
| 0.9034722222222222 | 0 |
| 0.9041666666666667 | 0 |
| 0.904861111111111 | 0 |
| 0.9055555555555556 | 0 |
| 0.90625 | 0 |
| 0.9069444444444444 | 0 |
| 0.907638888888889 | 0 |
| 0.9083333333333333 | 0 |
| 0.9090277777777778 | 0 |
| 0.9097222222222222 | 0 |
| 0.9104166666666668 | 0 |
| 0.9111111111111111 | 0 |
| 0.9118055555555555 | 0 |
| 0.9125 | 0 |
| 0.9131944444444445 | 0 |
| 0.9138888888888889 | 0 |
| 0.9145833333333333 | 0 |
| 0.9152777777777777 | 0 |
| 0.9159722222222223 | 0 |
| 0.9166666666666666 | 0 |
| 0.9173611111111111 | 0 |
| 0.9180555555555556 | 0 |
| 0.9187500000000001 | 0 |
| 0.9194444444444444 | 0 |
| 0.9201388888888888 | 0 |
| 0.9208333333333334 | 0 |
| 0.9215277777777778 | 0 |
| 0.9222222222222222 | 0 |
| 0.9229166666666666 | 0 |
| 0.9236111111111112 | 0 |
| 0.9243055555555556 | 0 |
| 0.9249999999999999 | 0 |
| 0.9256944444444444 | 0 |
| 0.9263888888888889 | 0 |
| 0.9270833333333334 | 0 |
| 0.9277777777777777 | 0 |
| 0.9284722222222223 | 0 |
| 0.9291666666666667 | 0 |
| 0.9298611111111111 | 0 |
| 0.9305555555555555 | 0 |
| 0.93125 | 0 |
| 0.9319444444444445 | 0 |
| 0.9326388888888889 | 0 |
| 0.9333333333333332 | 0 |
| 0.9340277777777778 | 0 |
| 0.9347222222222222 | 0 |
| 0.9354166666666667 | 0 |
| 0.936111111111111 | 0 |
| 0.9368055555555556 | 0 |
| 0.9375 | 0 |
| 0.9381944444444444 | 0 |
| 0.938888888888889 | 0 |
| 0.9395833333333333 | 0 |
| 0.9402777777777778 | 0 |
| 0.9409722222222222 | 0 |
| 0.9416666666666668 | 0 |
| 0.9423611111111111 | 0 |
| 0.9430555555555555 | 0 |
| 0.94375 | 0 |
| 0.9444444444444445 | 0 |
| 0.9451388888888889 | 0 |
| 0.9458333333333333 | 0 |
| 0.9465277777777777 | 0 |
| 0.9472222222222223 | 0 |
| 0.9479166666666666 | 0 |
| 0.9486111111111111 | 0 |
| 0.9493055555555556 | 0 |
| 0.9500000000000001 | 0 |
| 0.9506944444444444 | 0 |
| 0.9513888888888888 | 0 |
| 0.9520833333333334 | 0 |
| 0.9527777777777778 | 0 |
| 0.9534722222222222 | 0 |
| 0.9541666666666666 | 0 |
| 0.9548611111111112 | 0 |
| 0.9555555555555556 | 0 |
| 0.9562499999999999 | 0 |
| 0.9569444444444444 | 0 |
| 0.9576388888888889 | 0 |
| 0.9583333333333334 | 0 |
| 0.9590277777777777 | 0 |
| 0.9597222222222223 | 0 |
| 0.9604166666666667 | 0 |
| 0.9611111111111111 | 0 |
| 0.9618055555555555 | 0 |
| 0.9625 | 0 |
| 0.9631944444444445 | 0 |
| 0.9638888888888889 | 0 |
| 0.9645833333333332 | 0 |
| 0.9652777777777778 | 0 |
| 0.9659722222222222 | 0 |
| 0.9666666666666667 | 0 |
| 0.967361111111111 | 0 |
| 0.9680555555555556 | 0 |
| 0.96875 | 0 |
| 0.9694444444444444 | 0 |
| 0.970138888888889 | 0 |
| 0.9708333333333333 | 0 |
| 0.9715277777777778 | 0 |
| 0.9722222222222222 | 0 |
| 0.9729166666666668 | 0 |
| 0.9736111111111111 | 0 |
| 0.9743055555555555 | 0 |
| 0.975 | 0 |
| 0.9756944444444445 | 0 |
| 0.9763888888888889 | 0 |
| 0.9770833333333333 | 0 |
| 0.9777777777777777 | 0 |
| 0.9784722222222223 | 0 |
| 0.9791666666666666 | 0 |
| 0.9798611111111111 | 0 |
| 0.9805555555555556 | 0 |
| 0.9812500000000001 | 0 |
| 0.9819444444444444 | 0 |
| 0.9826388888888888 | 0 |
| 0.9833333333333334 | 0 |
| 0.9840277777777778 | 0 |
| 0.9847222222222222 | 0 |
| 0.9854166666666666 | 0 |
| 0.9861111111111112 | 0 |
| 0.9868055555555556 | 0 |
| 0.9874999999999999 | 0 |
| 0.9881944444444444 | 0 |
| 0.9888888888888889 | 0 |
| 0.9895833333333334 | 0 |
| 0.9902777777777777 | 0 |
| 0.9909722222222223 | 0 |
| 0.9916666666666667 | 0 |
| 0.9923611111111111 | 0 |
| 0.9930555555555555 | 0 |
| 0.99375 | 0 |
| 0.9944444444444445 | 0 |
| 0.9951388888888889 | 0 |
| 0.9958333333333332 | 0 |
| 0.9965277777777778 | 0 |
| 0.9972222222222222 | 0 |
| 0.9979166666666667 | 0 |
| 0.998611111111111 | 0 |
| 0.9993055555555556 | 0 |